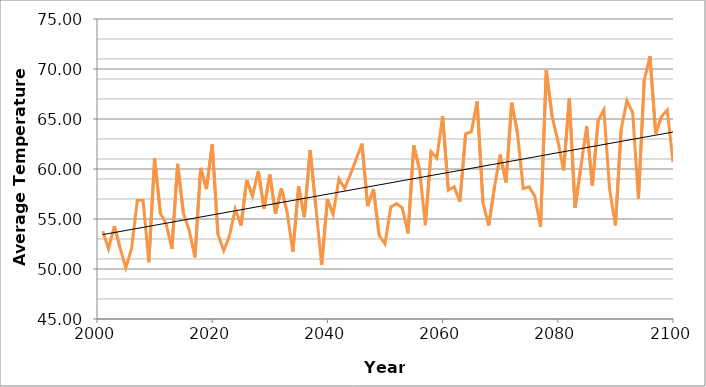
| Category | A2 |
|---|---|
| 2001.0 | 53.776 |
| 2002.0 | 52.012 |
| 2003.0 | 54.295 |
| 2004.0 | 52.104 |
| 2005.0 | 50.112 |
| 2006.0 | 52.036 |
| 2007.0 | 56.883 |
| 2008.0 | 56.878 |
| 2009.0 | 50.675 |
| 2010.0 | 61.072 |
| 2011.0 | 55.589 |
| 2012.0 | 54.509 |
| 2013.0 | 52.012 |
| 2014.0 | 60.503 |
| 2015.0 | 55.576 |
| 2016.0 | 53.875 |
| 2017.0 | 51.168 |
| 2018.0 | 60.105 |
| 2019.0 | 57.996 |
| 2020.0 | 62.46 |
| 2021.0 | 53.476 |
| 2022.0 | 51.831 |
| 2023.0 | 53.314 |
| 2024.0 | 55.996 |
| 2025.0 | 54.351 |
| 2026.0 | 58.894 |
| 2027.0 | 57.276 |
| 2028.0 | 59.801 |
| 2029.0 | 56.046 |
| 2030.0 | 59.459 |
| 2031.0 | 55.519 |
| 2032.0 | 58.075 |
| 2033.0 | 55.708 |
| 2034.0 | 51.723 |
| 2035.0 | 58.262 |
| 2036.0 | 55.18 |
| 2037.0 | 61.896 |
| 2038.0 | 56.174 |
| 2039.0 | 50.412 |
| 2040.0 | 56.961 |
| 2041.0 | 55.463 |
| 2042.0 | 59.011 |
| 2043.0 | 58.033 |
| 2044.0 | 59.461 |
| 2045.0 | 61.003 |
| 2046.0 | 62.528 |
| 2047.0 | 56.287 |
| 2048.0 | 57.976 |
| 2049.0 | 53.339 |
| 2050.0 | 52.509 |
| 2051.0 | 56.185 |
| 2052.0 | 56.552 |
| 2053.0 | 56.115 |
| 2054.0 | 53.56 |
| 2055.0 | 62.357 |
| 2056.0 | 59.938 |
| 2057.0 | 54.392 |
| 2058.0 | 61.743 |
| 2059.0 | 61.084 |
| 2060.0 | 65.278 |
| 2061.0 | 57.875 |
| 2062.0 | 58.23 |
| 2063.0 | 56.736 |
| 2064.0 | 63.516 |
| 2065.0 | 63.741 |
| 2066.0 | 66.762 |
| 2067.0 | 56.66 |
| 2068.0 | 54.336 |
| 2069.0 | 58.179 |
| 2070.0 | 61.441 |
| 2071.0 | 58.667 |
| 2072.0 | 66.625 |
| 2073.0 | 63.601 |
| 2074.0 | 58.023 |
| 2075.0 | 58.222 |
| 2076.0 | 57.285 |
| 2077.0 | 54.216 |
| 2078.0 | 69.885 |
| 2079.0 | 65.298 |
| 2080.0 | 62.845 |
| 2081.0 | 59.862 |
| 2082.0 | 67.053 |
| 2083.0 | 56.131 |
| 2084.0 | 60.147 |
| 2085.0 | 64.279 |
| 2086.0 | 58.33 |
| 2087.0 | 64.825 |
| 2088.0 | 65.932 |
| 2089.0 | 57.934 |
| 2090.0 | 54.367 |
| 2091.0 | 63.968 |
| 2092.0 | 66.83 |
| 2093.0 | 65.635 |
| 2094.0 | 57.027 |
| 2095.0 | 68.835 |
| 2096.0 | 71.28 |
| 2097.0 | 63.54 |
| 2098.0 | 65.223 |
| 2099.0 | 65.908 |
| 2100.0 | 60.696 |